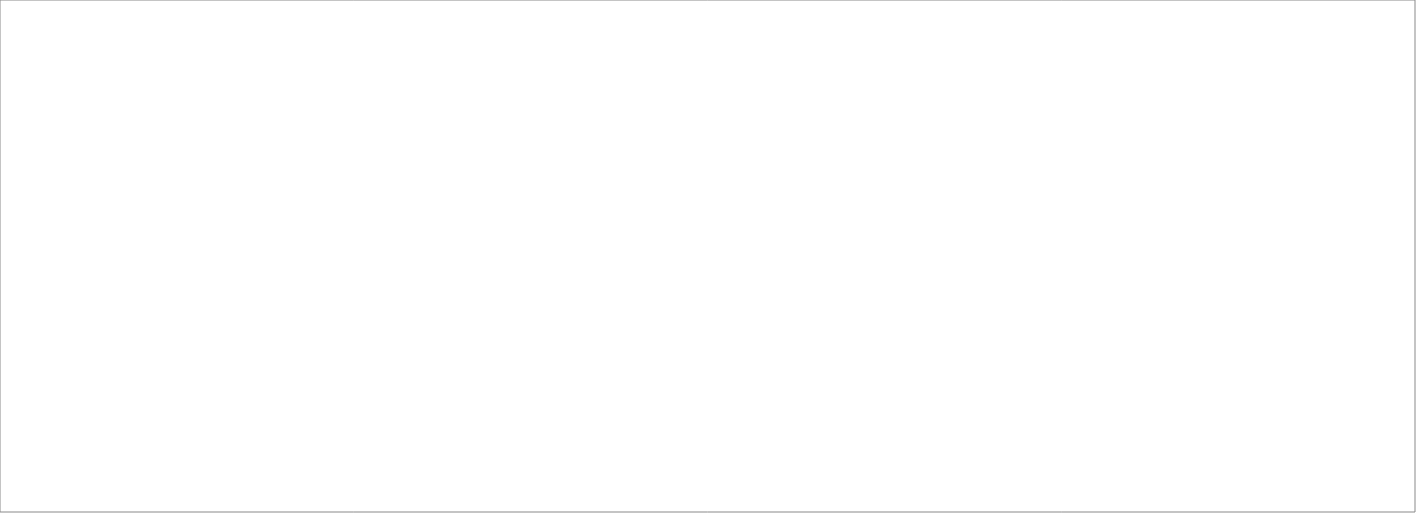
| Category | Total |
|---|---|
| Assessio Sverige AB | 100 |
| Michael Catenacci AB | 70 |
| Tarasso AB | 70 |
| OnePartner Group AB | 70 |
| Randstad AB | 70 |